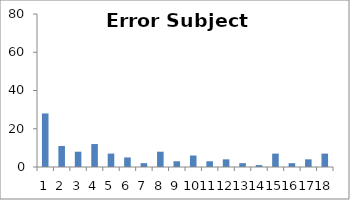
| Category | Sub9 |
|---|---|
| 0 | 28 |
| 1 | 11 |
| 2 | 8 |
| 3 | 12 |
| 4 | 7 |
| 5 | 5 |
| 6 | 2 |
| 7 | 8 |
| 8 | 3 |
| 9 | 6 |
| 10 | 3 |
| 11 | 4 |
| 12 | 2 |
| 13 | 1 |
| 14 | 7 |
| 15 | 2 |
| 16 | 4 |
| 17 | 7 |